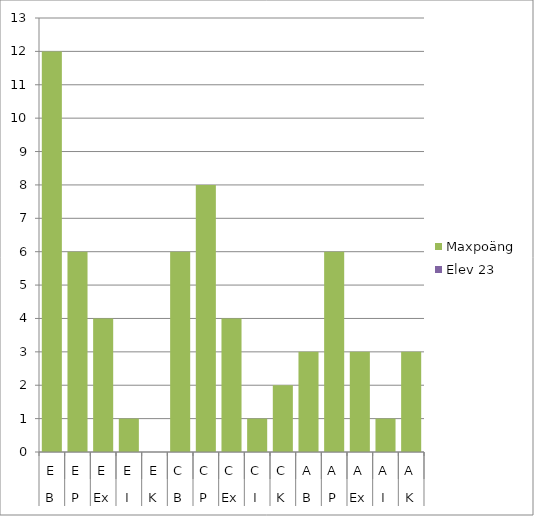
| Category | Maxpoäng | Elev 23 |
|---|---|---|
| 0 | 12 | 0 |
| 1 | 6 | 0 |
| 2 | 4 | 0 |
| 3 | 1 | 0 |
| 4 | 0 | 0 |
| 5 | 6 | 0 |
| 6 | 8 | 0 |
| 7 | 4 | 0 |
| 8 | 1 | 0 |
| 9 | 2 | 0 |
| 10 | 3 | 0 |
| 11 | 6 | 0 |
| 12 | 3 | 0 |
| 13 | 1 | 0 |
| 14 | 3 | 0 |